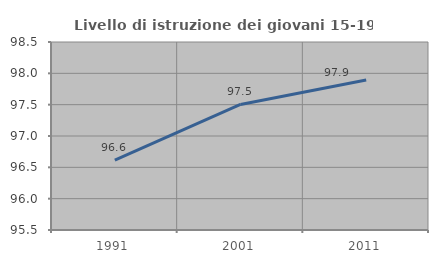
| Category | Livello di istruzione dei giovani 15-19 anni |
|---|---|
| 1991.0 | 96.614 |
| 2001.0 | 97.504 |
| 2011.0 | 97.895 |